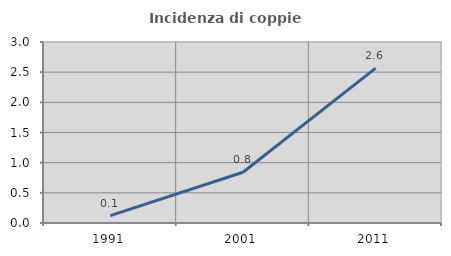
| Category | Incidenza di coppie miste |
|---|---|
| 1991.0 | 0.123 |
| 2001.0 | 0.841 |
| 2011.0 | 2.567 |